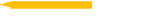
| Category | Difficult to accurately measure the benefits in terms of ROI |
|---|---|
| Difficult to accurately measure the benefits in terms of ROI | 3 |